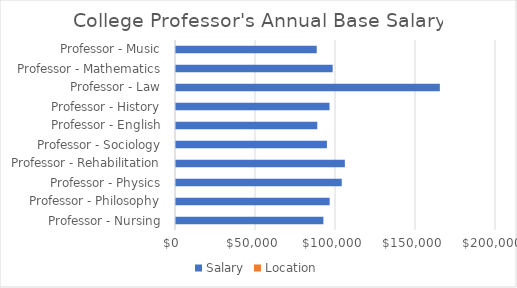
| Category | Salary | Location |
|---|---|---|
| Professor - Nursing | 92742 | 0 |
| Professor - Philosophy | 96649 | 0 |
| Professor - Physics | 104219 | 0 |
| Professor - Rehabilitation | 106161 | 0 |
| Professor - Sociology | 94954 | 0 |
| Professor - English | 88928 | 0 |
| Professor - History | 96564 | 0 |
| Professor - Law | 165525 | 0 |
| Professor - Mathematics | 98543 | 0 |
| Professor - Music | 88582 | 0 |